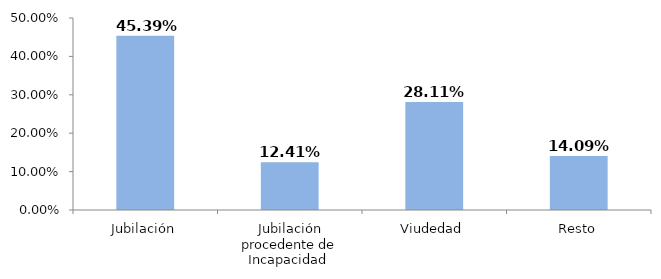
| Category | Series 0 |
|---|---|
| Jubilación | 0.454 |
| Jubilación procedente de Incapacidad  | 0.124 |
| Viudedad | 0.281 |
| Resto | 0.141 |